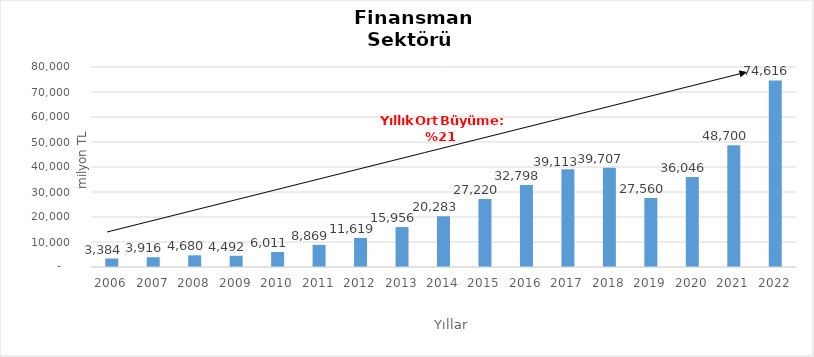
| Category | Finansman |
|---|---|
| 2006.0 | 3383.739 |
| 2007.0 | 3915.729 |
| 2008.0 | 4679.889 |
| 2009.0 | 4491.52 |
| 2010.0 | 6010.557 |
| 2011.0 | 8869.447 |
| 2012.0 | 11618.97 |
| 2013.0 | 15956.177 |
| 2014.0 | 20283 |
| 2015.0 | 27220 |
| 2016.0 | 32798 |
| 2017.0 | 39113 |
| 2018.0 | 39707 |
| 2019.0 | 27560 |
| 2020.0 | 36046 |
| 2021.0 | 48700 |
| 2022.0 | 74616 |